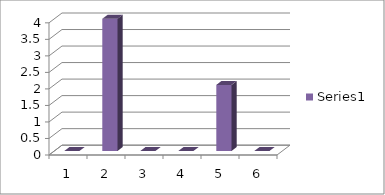
| Category | Series 0 |
|---|---|
| 0 | 0 |
| 1 | 4 |
| 2 | 0 |
| 3 | 0 |
| 4 | 2 |
| 5 | 0 |